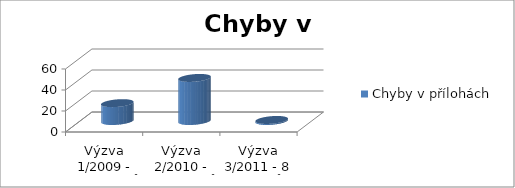
| Category | Chyby v přílohách  |
|---|---|
| Výzva 1/2009 - 19 projektů | 17 |
| Výzva 2/2010 - 22 projektů  | 41 |
| Výzva 3/2011 - 8 projektů  | 1 |